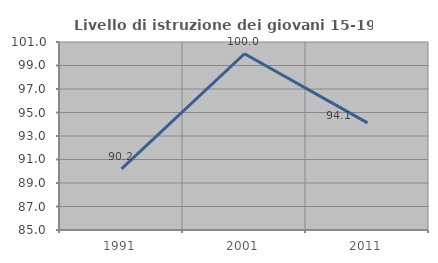
| Category | Livello di istruzione dei giovani 15-19 anni |
|---|---|
| 1991.0 | 90.196 |
| 2001.0 | 100 |
| 2011.0 | 94.118 |